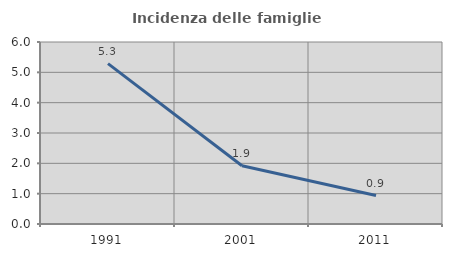
| Category | Incidenza delle famiglie numerose |
|---|---|
| 1991.0 | 5.287 |
| 2001.0 | 1.922 |
| 2011.0 | 0.939 |